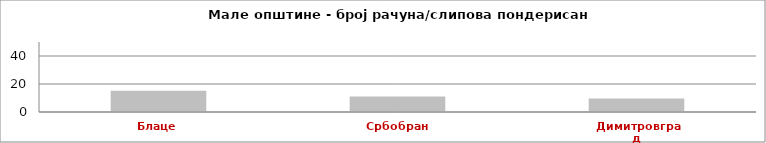
| Category | Series 0 |
|---|---|
| Блаце | 15.227 |
| Србобран | 11.038 |
| Димитровград | 9.569 |